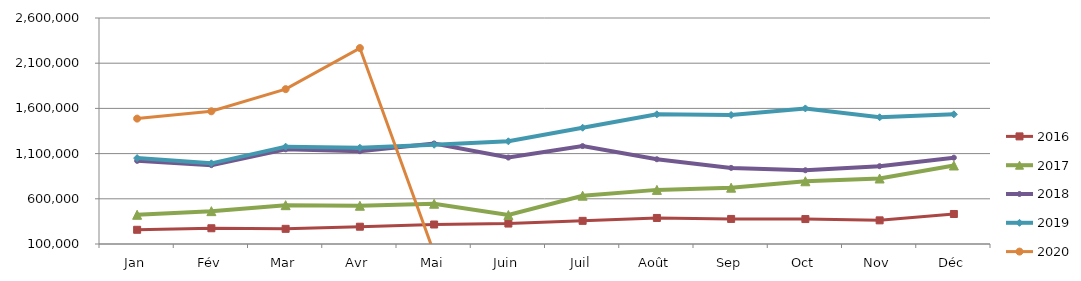
| Category | 2015 | 2016 | 2017 | 2018 | 2019 | 2020 |
|---|---|---|---|---|---|---|
| Jan |  | 257238.227 | 423360.679 | 1019658.015 | 1050220.805 | 1487095.506 |
| Fév |  | 274182.928 | 463512.001 | 972274.256 | 992184.961 | 1568141.915 |
| Mar |  | 267739.55 | 529345.368 | 1147166.528 | 1176757.88 | 1813146.21 |
| Avr |  | 291238.37 | 523228.337 | 1126714.531 | 1164825.987 | 2267448.511 |
| Mai |  | 315573.949 | 545414.731 | 1212070.878 | 1197851.486 | 0 |
| Juin |  | 326203.362 | 420430.116 | 1056092.947 | 1235809.908 | 0 |
| Juil |  | 356111.54 | 634345.533 | 1183060.966 | 1386180.582 | 0 |
| Août |  | 388007.58 | 698691.374 | 1037606.311 | 1534426.4 | 0 |
| Sep |  | 377114.56 | 722782.357 | 941820.554 | 1527323.009 | 0 |
| Oct |  | 376009.188 | 793837.955 | 915772.772 | 1599889.902 | 0 |
| Nov |  | 361587.784 | 824574.744 | 960817.552 | 1501599.407 | 0 |
| Déc |  | 431907.412 | 968412.649 | 1054685.303 | 1534756.751 | 0 |